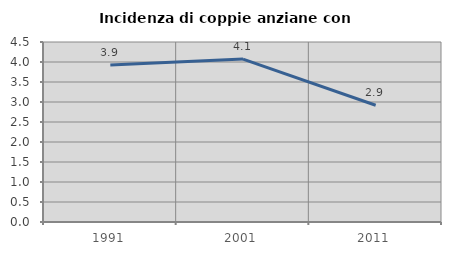
| Category | Incidenza di coppie anziane con figli |
|---|---|
| 1991.0 | 3.926 |
| 2001.0 | 4.072 |
| 2011.0 | 2.918 |